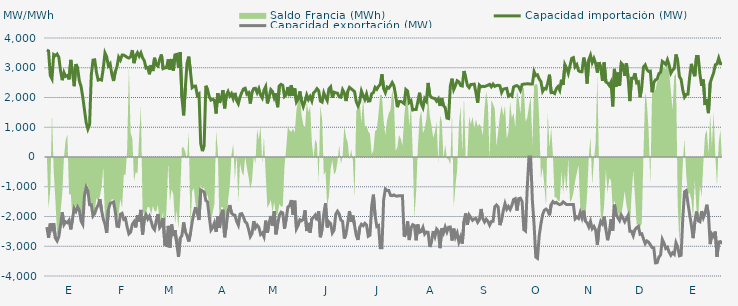
| Category | Capacidad importación (MW) | Capacidad exportación (MW) |
|---|---|---|
| 0 | 3596.708 | -2355.75 |
| 1900-01-01 | 3562.792 | -2716.417 |
| 1900-01-02 | 2738.75 | -2235.333 |
| 1900-01-03 | 2625.667 | -2410 |
| 1900-01-04 | 3444.083 | -2226.333 |
| 1900-01-05 | 3408.75 | -2728 |
| 1900-01-06 | 3460.583 | -2820.25 |
| 1900-01-07 | 3350.75 | -2676.083 |
| 1900-01-08 | 2899.917 | -2289.583 |
| 1900-01-09 | 2581.708 | -1858.083 |
| 1900-01-10 | 2842.042 | -2272.417 |
| 1900-01-11 | 2711.125 | -2177.417 |
| 1900-01-12 | 2740.458 | -2209.667 |
| 1900-01-13 | 2608.583 | -2127.083 |
| 1900-01-14 | 3264.042 | -2433.083 |
| 1900-01-15 | 2836.375 | -2085.417 |
| 1900-01-16 | 2379.792 | -1727.083 |
| 1900-01-17 | 3123.25 | -1827.083 |
| 1900-01-18 | 2982.792 | -1681.25 |
| 1900-01-19 | 2556.667 | -1789.667 |
| 1900-01-20 | 2375.667 | -2149.333 |
| 1900-01-21 | 2017.208 | -2261.458 |
| 1900-01-22 | 1585 | -1297.917 |
| 1900-01-23 | 1154.167 | -1022.917 |
| 1900-01-24 | 939.583 | -1143.75 |
| 1900-01-25 | 1093.75 | -1604.167 |
| 1900-01-26 | 2763.333 | -1604.167 |
| 1900-01-27 | 3256.375 | -1980.875 |
| 1900-01-28 | 3265.958 | -1897.917 |
| 1900-01-29 | 2849.625 | -1726.333 |
| 1900-01-30 | 2586.542 | -1614.583 |
| 1900-01-31 | 2607.375 | -1416.667 |
| 1900-02-01 | 2587.208 | -1789.583 |
| 1900-02-02 | 2978.5 | -2081.25 |
| 1900-02-03 | 3497.083 | -2256.292 |
| 1900-02-04 | 3370 | -2554.542 |
| 1900-02-05 | 3061.75 | -1771.917 |
| 1900-02-06 | 3134.875 | -1562.5 |
| 1900-02-07 | 2789.5 | -1537.5 |
| 1900-02-08 | 2555.75 | -1512.5 |
| 1900-02-09 | 2867.083 | -1825 |
| 1900-02-10 | 3026.833 | -2326.458 |
| 1900-02-11 | 3354.833 | -2337.292 |
| 1900-02-12 | 3258.292 | -1924.167 |
| 1900-02-13 | 3426.125 | -1893.75 |
| 1900-02-14 | 3424.167 | -2100 |
| 1900-02-15 | 3391.208 | -2070.833 |
| 1900-02-16 | 3348.208 | -2362.208 |
| 1900-02-17 | 3325.958 | -2584.917 |
| 1900-02-18 | 3372.292 | -2526.125 |
| 1900-02-19 | 3594.458 | -2261.833 |
| 1900-02-20 | 3154.208 | -2177.542 |
| 1900-02-21 | 3406.542 | -2366 |
| 1900-02-22 | 3506.792 | -1962 |
| 1900-02-23 | 3388.292 | -2170.833 |
| 1900-02-24 | 3502.625 | -1778.917 |
| 1900-02-25 | 3329.875 | -2606.583 |
| 1900-02-26 | 3238.958 | -2081.917 |
| 1900-02-27 | 2990.542 | -1937.25 |
| 1900-02-28 | 3009.542 | -2084.208 |
| 1900-02-28 | 2780.333 | -1987.25 |
| 1900-03-01 | 3090.792 | -2157.25 |
| 1900-03-02 | 2889.375 | -2369.167 |
| 1900-03-03 | 3335.375 | -2443.917 |
| 1900-03-04 | 3086.625 | -2135.417 |
| 1900-03-05 | 3054 | -1916.417 |
| 1900-03-06 | 3285.417 | -2373 |
| 1900-03-07 | 3443.292 | -2289.333 |
| 1900-03-08 | 2971.208 | -2047.917 |
| 1900-03-09 | 2996.292 | -2944.458 |
| 1900-03-10 | 3001.167 | -2971.542 |
| 1900-03-11 | 3281.375 | -2314.833 |
| 1900-03-12 | 2936.042 | -3043.167 |
| 1900-03-13 | 3294.792 | -2270.333 |
| 1900-03-14 | 2907.375 | -2657.667 |
| 1900-03-15 | 3433.583 | -2462.5 |
| 1900-03-16 | 3449.042 | -2914.583 |
| 1900-03-17 | 2992.458 | -3358.458 |
| 1900-03-18 | 3524.375 | -2728.208 |
| 1900-03-19 | 2000 | -2643.375 |
| 1900-03-20 | 1400 | -2200 |
| 1900-03-21 | 2323.375 | -2514.75 |
| 1900-03-22 | 3160.167 | -2645.333 |
| 1900-03-23 | 3372.083 | -2842.167 |
| 1900-03-24 | 2865.739 | -2564.565 |
| 1900-03-25 | 2332.667 | -2181.833 |
| 1900-03-26 | 2376.083 | -1906.25 |
| 1900-03-27 | 2381.25 | -1683.333 |
| 1900-03-28 | 2070.833 | -1891.667 |
| 1900-03-29 | 2120.083 | -2118.75 |
| 1900-03-30 | 449.25 | -1108.333 |
| 1900-03-31 | 200 | -1139.583 |
| 1900-04-01 | 395.833 | -1179.167 |
| 1900-04-02 | 2393.75 | -1462.5 |
| 1900-04-03 | 2262.25 | -1512.5 |
| 1900-04-04 | 2020.833 | -2007.167 |
| 1900-04-05 | 1912.5 | -2455.208 |
| 1900-04-06 | 1939.583 | -2371.125 |
| 1900-04-07 | 1908.333 | -2217.958 |
| 1900-04-08 | 1462.5 | -2517.542 |
| 1900-04-09 | 2145.208 | -2000.417 |
| 1900-04-10 | 1820.833 | -2386.167 |
| 1900-04-11 | 1983.333 | -1930.75 |
| 1900-04-12 | 2245.833 | -1772.917 |
| 1900-04-13 | 1635.417 | -2697.5 |
| 1900-04-14 | 2079.167 | -2299.625 |
| 1900-04-15 | 2200 | -1818.75 |
| 1900-04-16 | 2052.083 | -1616.667 |
| 1900-04-17 | 2133.333 | -1885.417 |
| 1900-04-18 | 1962.5 | -1940.792 |
| 1900-04-19 | 2154.167 | -1955.875 |
| 1900-04-20 | 1906.25 | -2160.458 |
| 1900-04-21 | 1791.667 | -2289.583 |
| 1900-04-22 | 2014.583 | -1920.333 |
| 1900-04-23 | 2166.667 | -1904.167 |
| 1900-04-24 | 2285.417 | -2016.25 |
| 1900-04-25 | 2310.417 | -2177.917 |
| 1900-04-26 | 2114.583 | -2230.875 |
| 1900-04-27 | 2160.417 | -2431.625 |
| 1900-04-28 | 1797.917 | -2674.417 |
| 1900-04-29 | 2180.625 | -2574 |
| 1900-04-30 | 2300 | -2155.333 |
| 1900-05-01 | 2310.417 | -2380.708 |
| 1900-05-02 | 2160.417 | -2290.5 |
| 1900-05-03 | 2295.833 | -2360.958 |
| 1900-05-04 | 2083.333 | -2603 |
| 1900-05-05 | 1983.333 | -2551.458 |
| 1900-05-06 | 2243.75 | -2680.375 |
| 1900-05-07 | 2364.583 | -2139.583 |
| 1900-05-08 | 1802.083 | -2551.375 |
| 1900-05-09 | 2012.5 | -2222.583 |
| 1900-05-10 | 2264.583 | -1983.333 |
| 1900-05-11 | 2200 | -2304.167 |
| 1900-05-12 | 1991.667 | -1823 |
| 1900-05-13 | 2139.583 | -2598.667 |
| 1900-05-14 | 1674.583 | -2262.5 |
| 1900-05-15 | 2391.667 | -1958.333 |
| 1900-05-16 | 2442.875 | -1852.083 |
| 1900-05-17 | 2406.25 | -1879.167 |
| 1900-05-18 | 2035.417 | -2408.5 |
| 1900-05-19 | 2093.75 | -2077.083 |
| 1900-05-20 | 2353.042 | -1679.167 |
| 1900-05-21 | 2047.917 | -1637.5 |
| 1900-05-22 | 2414.917 | -1445.833 |
| 1900-05-23 | 2054.167 | -1935.417 |
| 1900-05-24 | 2304.167 | -1468.75 |
| 1900-05-25 | 1852.083 | -2413.583 |
| 1900-05-26 | 1950 | -2298.583 |
| 1900-05-27 | 2204.167 | -2108.333 |
| 1900-05-28 | 1870.833 | -2142.875 |
| 1900-05-29 | 1693.75 | -2094.083 |
| 1900-05-30 | 1875 | -1793.75 |
| 1900-05-31 | 2087.5 | -2489.25 |
| 1900-06-01 | 1929.167 | -2216.167 |
| 1900-06-02 | 2031.25 | -2542 |
| 1900-06-03 | 1885.417 | -2072.833 |
| 1900-06-04 | 2156.25 | -2029.167 |
| 1900-06-05 | 2208.333 | -1953 |
| 1900-06-06 | 2297.917 | -2127.083 |
| 1900-06-07 | 2229.167 | -1822.917 |
| 1900-06-08 | 1879.167 | -2695.583 |
| 1900-06-09 | 1845.833 | -2427.667 |
| 1900-06-10 | 2156.25 | -1908.417 |
| 1900-06-11 | 2010.417 | -1551.375 |
| 1900-06-12 | 1897.625 | -2367.333 |
| 1900-06-13 | 2291.667 | -2179.167 |
| 1900-06-14 | 2358.333 | -2236.833 |
| 1900-06-15 | 1997.917 | -2551.708 |
| 1900-06-16 | 2179.167 | -2457.875 |
| 1900-06-17 | 2156.25 | -1922.667 |
| 1900-06-18 | 2145.833 | -1823.917 |
| 1900-06-19 | 2022.917 | -1916.417 |
| 1900-06-20 | 2008.333 | -2121.167 |
| 1900-06-21 | 2260.417 | -2164.667 |
| 1900-06-22 | 2152.083 | -2739.958 |
| 1900-06-23 | 1881 | -2582.833 |
| 1900-06-24 | 2206.25 | -2222.083 |
| 1900-06-25 | 2339.583 | -1816.667 |
| 1900-06-26 | 2293.75 | -2177.833 |
| 1900-06-27 | 2245.833 | -1968.75 |
| 1900-06-28 | 2195.833 | -2304.458 |
| 1900-06-29 | 1858.208 | -2638.917 |
| 1900-06-30 | 1718.75 | -2788.083 |
| 1900-07-01 | 1858.333 | -2369.542 |
| 1900-07-02 | 2216.667 | -2260.583 |
| 1900-07-03 | 2066.667 | -2309.375 |
| 1900-07-04 | 1935.417 | -2231 |
| 1900-07-05 | 2118.292 | -2285.25 |
| 1900-07-06 | 1879.583 | -2663 |
| 1900-07-07 | 1887.5 | -2627.5 |
| 1900-07-08 | 2127.083 | -1647.917 |
| 1900-07-09 | 2162.5 | -1266.667 |
| 1900-07-10 | 2338.667 | -1964.583 |
| 1900-07-11 | 2277.083 | -2337.25 |
| 1900-07-12 | 2373.75 | -2304.167 |
| 1900-07-13 | 2435.083 | -3048.333 |
| 1900-07-14 | 2780.708 | -3048.208 |
| 1900-07-15 | 2300 | -1435 |
| 1900-07-16 | 2164.583 | -1077.083 |
| 1900-07-17 | 2350 | -1125 |
| 1900-07-18 | 2314.583 | -1125 |
| 1900-07-19 | 2395.625 | -1287.5 |
| 1900-07-20 | 2501.583 | -1302.083 |
| 1900-07-21 | 2389.417 | -1275 |
| 1900-07-22 | 2080.375 | -1308.333 |
| 1900-07-23 | 1675 | -1316.667 |
| 1900-07-24 | 1862.5 | -1300 |
| 1900-07-25 | 1866.708 | -1300 |
| 1900-07-26 | 1837.292 | -1300 |
| 1900-07-27 | 1793.75 | -2680.333 |
| 1900-07-28 | 2268.333 | -2563.75 |
| 1900-07-29 | 2217.333 | -2160.333 |
| 1900-07-30 | 1831.25 | -2791.75 |
| 1900-07-31 | 1890.083 | -2386.583 |
| 1900-08-01 | 1581.667 | -2273.25 |
| 1900-08-02 | 1595.833 | -2304.167 |
| 1900-08-03 | 1593.75 | -2799.042 |
| 1900-08-04 | 1860.75 | -2268.667 |
| 1900-08-05 | 2160.5 | -2533.875 |
| 1900-08-06 | 1785.417 | -2508.667 |
| 1900-08-07 | 1658.333 | -2368.167 |
| 1900-08-08 | 1958.333 | -2590.5 |
| 1900-08-09 | 1875.083 | -2522 |
| 1900-08-10 | 2489.792 | -2532.75 |
| 1900-08-11 | 2064.583 | -3024.833 |
| 1900-08-12 | 2001.333 | -2838.125 |
| 1900-08-13 | 1979.167 | -2490.417 |
| 1900-08-14 | 1966.667 | -2671.375 |
| 1900-08-15 | 1877.792 | -2424.333 |
| 1900-08-16 | 1957.75 | -2493.167 |
| 1900-08-17 | 1716.667 | -3063.708 |
| 1900-08-18 | 1978.5 | -2394.708 |
| 1900-08-19 | 1729.167 | -2549 |
| 1900-08-20 | 1666.667 | -2355.5 |
| 1900-08-21 | 1308.333 | -2520.458 |
| 1900-08-22 | 1293.75 | -2359.417 |
| 1900-08-23 | 2383.833 | -2353.167 |
| 1900-08-24 | 2632.25 | -2807.083 |
| 1900-08-25 | 2269.167 | -2407.042 |
| 1900-08-26 | 2400.75 | -2695.042 |
| 1900-08-27 | 2564.417 | -2553.583 |
| 1900-08-28 | 2525.583 | -2853.583 |
| 1900-08-29 | 2404.5 | -2690.292 |
| 1900-08-30 | 2386.042 | -2912.083 |
| 1900-08-31 | 2890.042 | -2155.708 |
| 1900-09-01 | 2668.625 | -1896.5 |
| 1900-09-02 | 2403.083 | -2272.75 |
| 1900-09-03 | 2332.833 | -1950 |
| 1900-09-04 | 2437.5 | -2037.5 |
| 1900-09-05 | 2441.667 | -2129 |
| 1900-09-06 | 2450 | -2079.167 |
| 1900-09-07 | 2159.292 | -2066.667 |
| 1900-09-08 | 1825 | -2195.667 |
| 1900-09-09 | 2412.5 | -2108.333 |
| 1900-09-10 | 2355.5 | -1747.917 |
| 1900-09-11 | 2377.083 | -2070.833 |
| 1900-09-12 | 2366.667 | -2185.333 |
| 1900-09-13 | 2387.5 | -2091.667 |
| 1900-09-14 | 2412.5 | -2164.583 |
| 1900-09-15 | 2443 | -2291.292 |
| 1900-09-16 | 2360.417 | -2168.75 |
| 1900-09-17 | 2450 | -2160.417 |
| 1900-09-18 | 2375 | -1668.75 |
| 1900-09-19 | 2402.083 | -1612.5 |
| 1900-09-20 | 2412 | -1683.333 |
| 1900-09-21 | 2393.75 | -2289.583 |
| 1900-09-22 | 2168.625 | -2114.083 |
| 1900-09-23 | 2281.25 | -1800 |
| 1900-09-24 | 2295.833 | -1566.667 |
| 1900-09-25 | 2306.25 | -1754.167 |
| 1900-09-26 | 2050 | -1662.5 |
| 1900-09-27 | 2100 | -1762.5 |
| 1900-09-28 | 2052.083 | -1629.167 |
| 1900-09-29 | 2351.708 | -1429.167 |
| 1900-09-30 | 2387.5 | -1400 |
| 1900-10-01 | 2400 | -1800 |
| 1900-10-02 | 2355.875 | -1400 |
| 1900-10-03 | 2239.583 | -1383.333 |
| 1900-10-04 | 2435.417 | -1500 |
| 1900-10-05 | 2450 | -2442.875 |
| 1900-10-06 | 2455.875 | -2487.042 |
| 1900-10-07 | 2459.792 | -1025 |
| 1900-10-08 | 2457.708 | 0 |
| 1900-10-09 | 2450 | 0 |
| 1900-10-10 | 2450 | -1462.5 |
| 1900-10-11 | 2870.833 | -2280.5 |
| 1900-10-12 | 2735.958 | -3362.458 |
| 1900-10-13 | 2761.833 | -3404.708 |
| 1900-10-14 | 2618.708 | -2638.958 |
| 1900-10-15 | 2538.583 | -2247.25 |
| 1900-10-16 | 2208.333 | -1933.333 |
| 1900-10-17 | 2304.167 | -1791.667 |
| 1900-10-18 | 2285.083 | -1750 |
| 1900-10-19 | 2485.708 | -1800 |
| 1900-10-20 | 2766.917 | -1958.333 |
| 1900-10-21 | 2164.458 | -1600 |
| 1900-10-22 | 2172.792 | -1500 |
| 1900-10-23 | 2133.333 | -1550 |
| 1900-10-24 | 2297.917 | -1525 |
| 1900-10-25 | 2366.667 | -1575 |
| 1900-10-26 | 2243.25 | -1600 |
| 1900-10-27 | 2598.52 | -1580 |
| 1900-10-28 | 2420.167 | -1508.333 |
| 1900-10-29 | 3106.25 | -1550 |
| 1900-10-30 | 2984.667 | -1600 |
| 1900-10-31 | 2812.083 | -1600 |
| 1900-11-01 | 3067.5 | -1600 |
| 1900-11-02 | 3316.25 | -1600 |
| 1900-11-03 | 3341.25 | -1600 |
| 1900-11-04 | 3032 | -2077.083 |
| 1900-11-05 | 3104.417 | -2016.75 |
| 1900-11-06 | 2900 | -2064.583 |
| 1900-11-07 | 2867 | -1862.5 |
| 1900-11-08 | 2867 | -2045.833 |
| 1900-11-09 | 3341.083 | -1804.167 |
| 1900-11-10 | 3131.083 | -2154.167 |
| 1900-11-11 | 2468.083 | -2216.667 |
| 1900-11-12 | 3265.167 | -2350 |
| 1900-11-13 | 3420.583 | -2164.833 |
| 1900-11-14 | 3174.333 | -2409.417 |
| 1900-11-15 | 3313.292 | -2335.75 |
| 1900-11-16 | 3146.333 | -2455.542 |
| 1900-11-17 | 2838 | -2955.75 |
| 1900-11-18 | 3188.5 | -2388.25 |
| 1900-11-19 | 2992.083 | -2162.5 |
| 1900-11-20 | 2556.125 | -2248.583 |
| 1900-11-21 | 3177.25 | -2002.917 |
| 1900-11-22 | 2521.083 | -2429.667 |
| 1900-11-23 | 2489.167 | -2797.208 |
| 1900-11-24 | 2404.583 | -2531.417 |
| 1900-11-25 | 2519.708 | -2094.75 |
| 1900-11-26 | 1700 | -2472.792 |
| 1900-11-27 | 2961.583 | -1602.083 |
| 1900-11-28 | 2367.125 | -1916.667 |
| 1900-11-29 | 2839.792 | -2043.75 |
| 1900-11-30 | 2395.833 | -2137.5 |
| 1900-12-01 | 3152.583 | -1952.083 |
| 1900-12-02 | 3090.75 | -2052.083 |
| 1900-12-03 | 2732.167 | -2177.083 |
| 1900-12-04 | 3154.208 | -2069.625 |
| 1900-12-05 | 2672.375 | -1960.417 |
| 1900-12-06 | 1879.167 | -2497 |
| 1900-12-07 | 2643.583 | -2497 |
| 1900-12-08 | 2643.083 | -2647.583 |
| 1900-12-09 | 2816.917 | -2441.083 |
| 1900-12-10 | 2493.125 | -2374 |
| 1900-12-11 | 2524.458 | -2332.167 |
| 1900-12-12 | 2008.333 | -2601 |
| 1900-12-13 | 2361.875 | -2582.083 |
| 1900-12-14 | 3027.625 | -2755.833 |
| 1900-12-15 | 3096.375 | -2911.667 |
| 1900-12-16 | 2940.417 | -2822.917 |
| 1900-12-17 | 2875 | -2863.5 |
| 1900-12-18 | 2886.833 | -2951.167 |
| 1900-12-19 | 2177.083 | -3040.5 |
| 1900-12-20 | 2503.583 | -3052 |
| 1900-12-21 | 2591.792 | -3558.75 |
| 1900-12-22 | 2617 | -3551.083 |
| 1900-12-23 | 2801.958 | -3364.542 |
| 1900-12-24 | 2846.25 | -3293 |
| 1900-12-25 | 3214.542 | -2770.875 |
| 1900-12-26 | 3169.167 | -2897.917 |
| 1900-12-27 | 3108.042 | -3073.375 |
| 1900-12-28 | 3266.042 | -3032.75 |
| 1900-12-29 | 3083.708 | -3200.292 |
| 1900-12-30 | 2817.875 | -3304.5 |
| 1900-12-31 | 2919.708 | -3219.583 |
| 1901-01-01 | 2976.042 | -3273.667 |
| 1901-01-02 | 3445.625 | -2880.583 |
| 1901-01-03 | 3231.042 | -3016.625 |
| 1901-01-04 | 2703.75 | -3322.875 |
| 1901-01-05 | 2610.417 | -3303 |
| 1901-01-06 | 2240.75 | -2035 |
| 1901-01-07 | 2016.667 | -1167.583 |
| 1901-01-08 | 2102.083 | -1128.25 |
| 1901-01-09 | 2110.417 | -1558.333 |
| 1901-01-10 | 2691.083 | -1930.667 |
| 1901-01-11 | 3131 | -2286.417 |
| 1901-01-12 | 2867 | -2728 |
| 1901-01-13 | 2713.167 | -2194.5 |
| 1901-01-14 | 3375.5 | -1833.333 |
| 1901-01-15 | 3377.833 | -2144.5 |
| 1901-01-16 | 2788.375 | -2175 |
| 1901-01-17 | 2393.917 | -1818.5 |
| 1901-01-18 | 2602.208 | -2041.542 |
| 1901-01-19 | 1745.833 | -1898.542 |
| 1901-01-20 | 1941.667 | -1603.542 |
| 1901-01-21 | 1475 | -1942.833 |
| 1901-01-22 | 2488.208 | -2928.792 |
| 1901-01-23 | 2665.583 | -2587.083 |
| 1901-01-24 | 2824.833 | -2666.708 |
| 1901-01-25 | 3099 | -2507.042 |
| 1901-01-26 | 3125.208 | -3352.792 |
| 1901-01-27 | 3325.625 | -2855.792 |
| 1901-01-28 | 3135.042 | -2844.083 |
| 1901-01-29 | 3141.667 | -2918 |